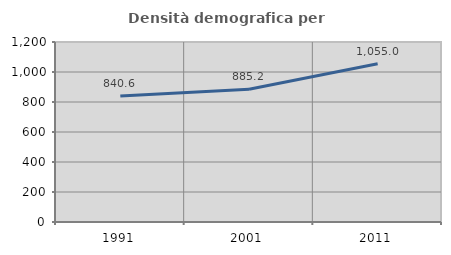
| Category | Densità demografica |
|---|---|
| 1991.0 | 840.55 |
| 2001.0 | 885.212 |
| 2011.0 | 1055.011 |